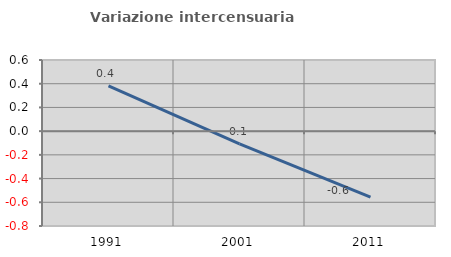
| Category | Variazione intercensuaria annua |
|---|---|
| 1991.0 | 0.382 |
| 2001.0 | -0.107 |
| 2011.0 | -0.556 |